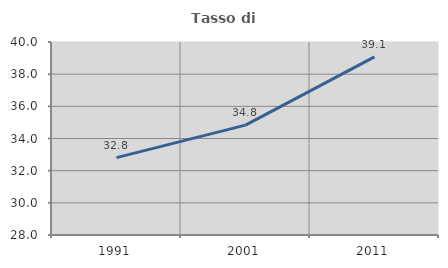
| Category | Tasso di occupazione   |
|---|---|
| 1991.0 | 32.81 |
| 2001.0 | 34.831 |
| 2011.0 | 39.071 |